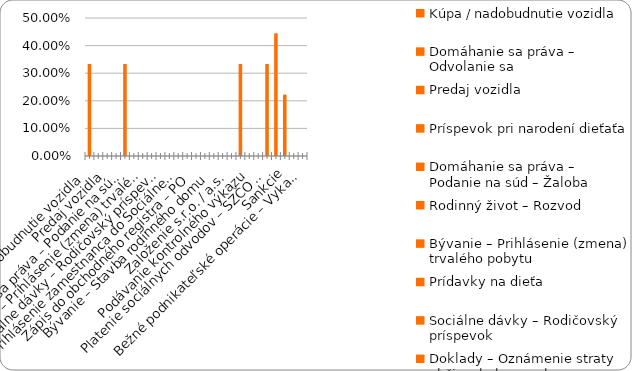
| Category | % |
|---|---|
| Kúpa / nadobudnutie vozidla | 0.333 |
| Domáhanie sa práva – Odvolanie sa | 0 |
| Predaj vozidla | 0 |
| Príspevok pri narodení dieťaťa | 0 |
| Domáhanie sa práva – Podanie na súd – Žaloba | 0.333 |
| Rodinný život – Rozvod | 0 |
| Bývanie – Prihlásenie (zmena) trvalého pobytu | 0 |
| Prídavky na dieťa | 0 |
| Sociálne dávky – Rodičovský príspevok | 0 |
| Doklady – Oznámenie straty občianskeho preukazu | 0 |
| Prihlásenie zamestnanca do Sociálnej poisťovne | 0 |
| Plnenie si daňových povinností – zamestnanec (FO) | 0 |
| Zápis do obchodného registra – PO | 0 |
| Živnosť - ukončenie | 0 |
| Bývanie – Stavba rodinného domu | 0 |
| Sociálne dávky – Príspevok v nezamestnanosti | 0 |
| Založenie s.r.o. / a.s. | 0 |
| Živnosť – založenie | 0.333 |
| Podávanie kontrolného výkazu | 0 |
| Plnenie si daňových povinností – SZČO / PO  | 0 |
| Platenie sociálnych odvodov – SZČO / PO | 0.333 |
| Živnosť - prerušenie | 0.444 |
| Sankcie | 0.222 |
| Živnosť - zmena | 0 |
| Bežné podnikateľské operácie – Vykazovanie štatistík | 0 |